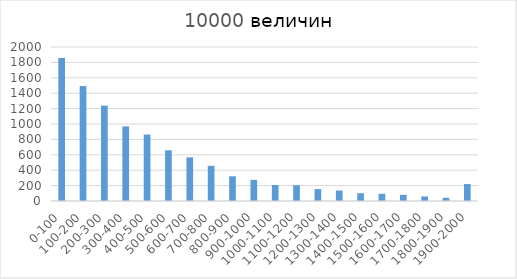
| Category | Series 0 |
|---|---|
| 0-100 | 1858 |
| 100-200 | 1493 |
| 200-300 | 1239 |
| 300-400 | 969 |
| 400-500 | 863 |
| 500-600 | 659 |
| 600-700 | 567 |
| 700-800 | 457 |
| 800-900 | 321 |
| 900-1000 | 275 |
| 1000-1100 | 208 |
| 1100-1200 | 205 |
| 1200-1300 | 155 |
| 1300-1400 | 136 |
| 1400-1500 | 101 |
| 1500-1600 | 93 |
| 1600-1700 | 80 |
| 1700-1800 | 59 |
| 1800-1900 | 42 |
| 1900-2000 | 220 |